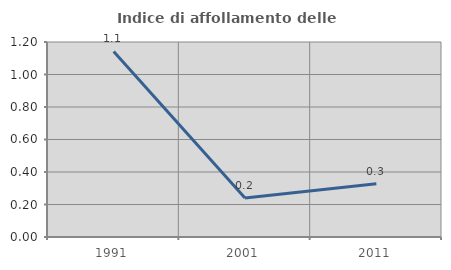
| Category | Indice di affollamento delle abitazioni  |
|---|---|
| 1991.0 | 1.142 |
| 2001.0 | 0.24 |
| 2011.0 | 0.328 |